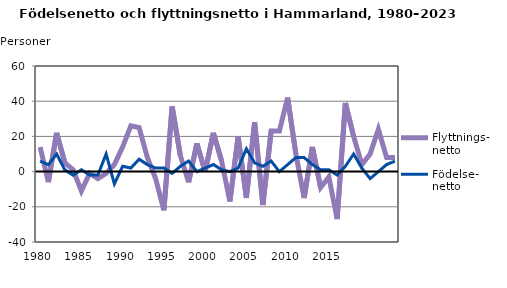
| Category | Flyttnings- netto | Födelse- netto |
|---|---|---|
| 1980.0 | 14 | 6 |
| 1981.0 | -6 | 4 |
| 1982.0 | 22 | 10 |
| 1983.0 | 5 | 1 |
| 1984.0 | 1 | -2 |
| 1985.0 | -11 | 1 |
| 1986.0 | -1 | -2 |
| 1987.0 | -4 | -2 |
| 1988.0 | -1 | 10 |
| 1989.0 | 4 | -7 |
| 1990.0 | 14 | 3 |
| 1991.0 | 26 | 2 |
| 1992.0 | 25 | 7 |
| 1993.0 | 8 | 4 |
| 1994.0 | -4 | 2 |
| 1995.0 | -22 | 2 |
| 1996.0 | 37 | -1 |
| 1997.0 | 9 | 3 |
| 1998.0 | -6 | 6 |
| 1999.0 | 16 | 0 |
| 2000.0 | 0 | 2 |
| 2001.0 | 22 | 4 |
| 2002.0 | 6 | 1 |
| 2003.0 | -17 | 0 |
| 2004.0 | 20 | 2 |
| 2005.0 | -15 | 13 |
| 2006.0 | 28 | 5 |
| 2007.0 | -19 | 3 |
| 2008.0 | 23 | 6 |
| 2009.0 | 23 | 0 |
| 2010.0 | 42 | 4 |
| 2011.0 | 10 | 8 |
| 2012.0 | -15 | 8 |
| 2013.0 | 14 | 4 |
| 2014.0 | -9 | 1 |
| 2015.0 | -3 | 1 |